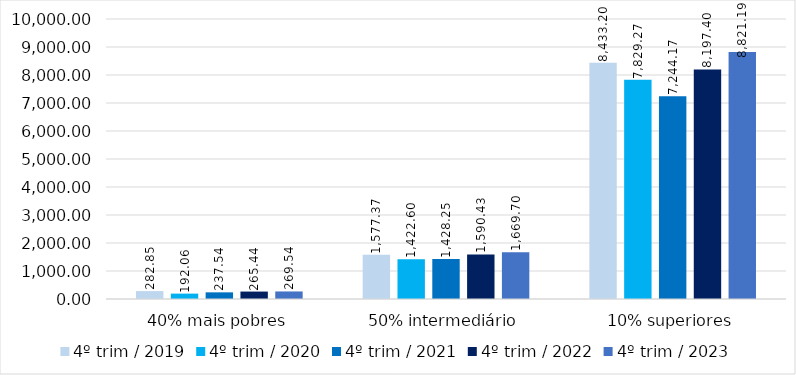
| Category | 4º trim / 2019 | 4º trim / 2020 | 4º trim / 2021 | 4º trim / 2022 | 4º trim / 2023 |
|---|---|---|---|---|---|
| 40% mais pobres | 282.85 | 192.065 | 237.538 | 265.437 | 269.535 |
| 50% intermediário | 1577.369 | 1422.595 | 1428.248 | 1590.433 | 1669.699 |
| 10% superiores | 8433.198 | 7829.265 | 7244.165 | 8197.398 | 8821.187 |